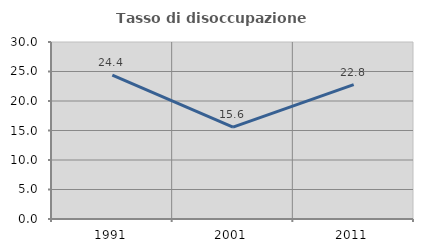
| Category | Tasso di disoccupazione giovanile  |
|---|---|
| 1991.0 | 24.373 |
| 2001.0 | 15.561 |
| 2011.0 | 22.772 |